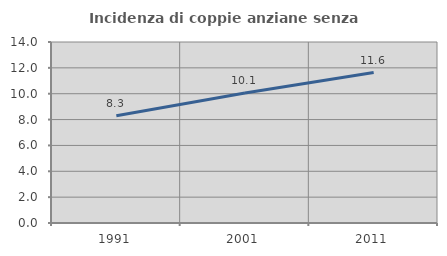
| Category | Incidenza di coppie anziane senza figli  |
|---|---|
| 1991.0 | 8.302 |
| 2001.0 | 10.054 |
| 2011.0 | 11.64 |